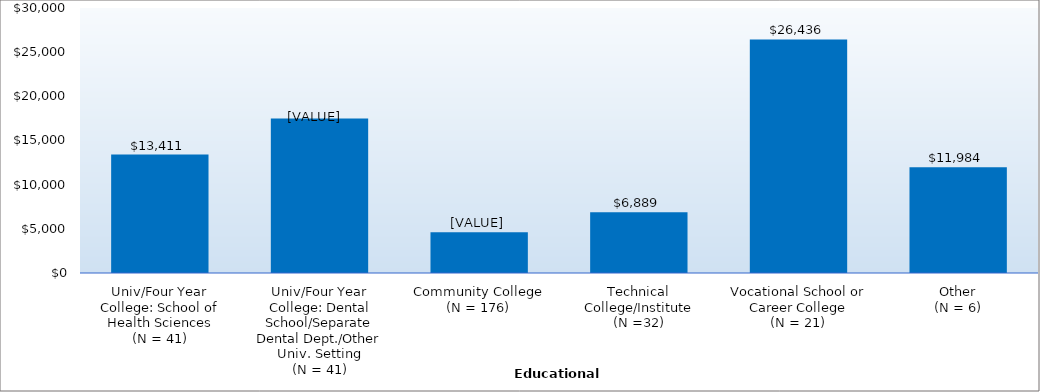
| Category | Series 0 |
|---|---|
| Univ/Four Year College: School of Health Sciences
(N = 41) | 13411 |
| Univ/Four Year College: Dental School/Separate Dental Dept./Other Univ. Setting
(N = 41) | 17500.78 |
| Community College
(N = 176) | 4612 |
| Technical College/Institute
(N =32) | 6889 |
| Vocational School or Career College
(N = 21) | 26436 |
| Other
(N = 6) | 11984 |